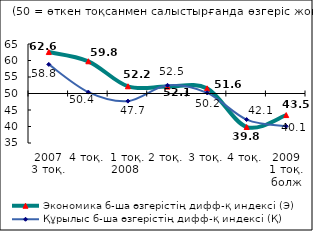
| Category | Экономика б-ша өзгерістің дифф-қ индексі (Э) | Құрылыс б-ша өзгерістің дифф-қ индексі (Қ) |
|---|---|---|
| 2007 3 тоқ. | 62.56 | 58.82 |
| 4 тоқ. | 59.76 | 50.42 |
| 1 тоқ. 2008  | 52.185 | 47.685 |
| 2 тоқ. | 52.085 | 52.49 |
| 3 тоқ. | 51.56 | 50.205 |
| 4 тоқ.  | 39.84 | 42.1 |
| 2009 1 тоқ. болж | 43.465 | 40.08 |